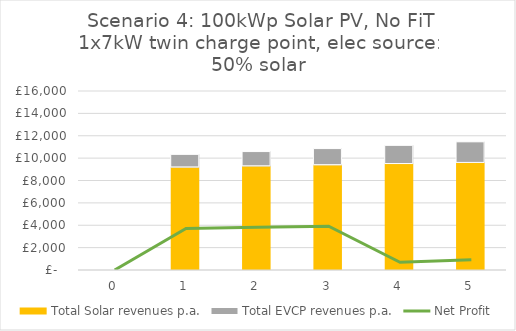
| Category | Total Solar revenues p.a. | Total EVCP revenues p.a. |
|---|---|---|
| 0.0 | 0 | 0 |
| 1.0 | 9170 | 1166.667 |
| 2.0 | 9269.81 | 1315.417 |
| 3.0 | 9370.134 | 1483.132 |
| 4.0 | 9470.857 | 1672.232 |
| 5.0 | 9571.853 | 1885.441 |